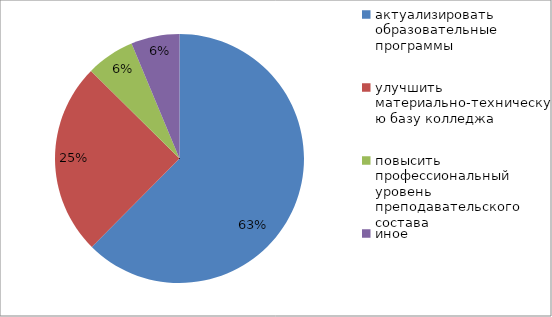
| Category | Series 0 |
|---|---|
| актуализировать образовательные программы  | 62.5 |
| улучшить материально-техническую базу колледжа | 25 |
| повысить профессиональный уровень преподавательского состава | 6.3 |
| иное | 6.3 |